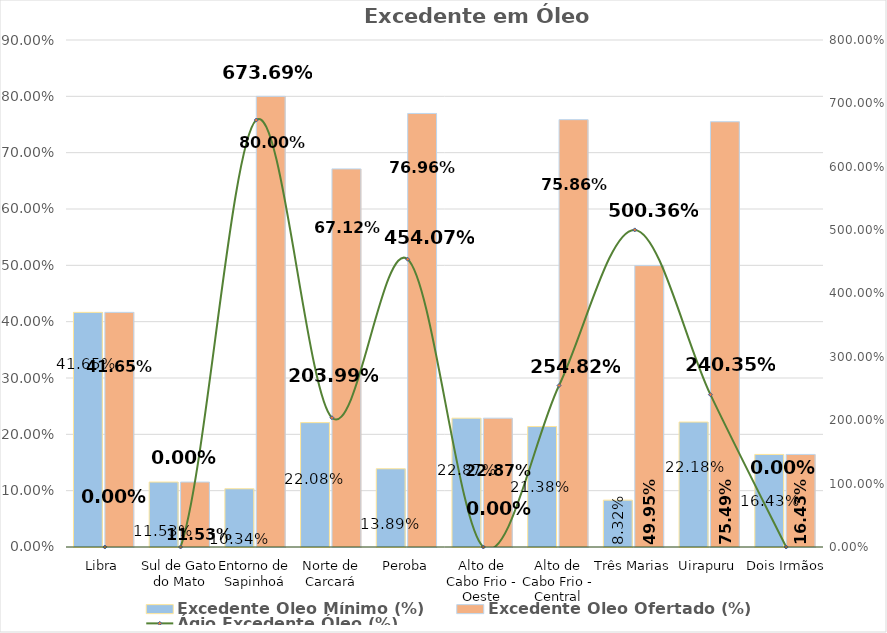
| Category | Excedente Óleo Mínimo (%) | Excedente Óleo Ofertado (%) |
|---|---|---|
| Libra | 0.416 | 0.416 |
| Sul de Gato do Mato | 0.115 | 0.115 |
| Entorno de Sapinhoá | 0.103 | 0.8 |
| Norte de Carcará | 0.221 | 0.671 |
| Peroba | 0.139 | 0.77 |
| Alto de Cabo Frio - Oeste | 0.229 | 0.229 |
| Alto de Cabo Frio - Central | 0.214 | 0.759 |
| Três Marias | 0.083 | 0.5 |
| Uirapuru | 0.222 | 0.755 |
| Dois Irmãos | 0.164 | 0.164 |